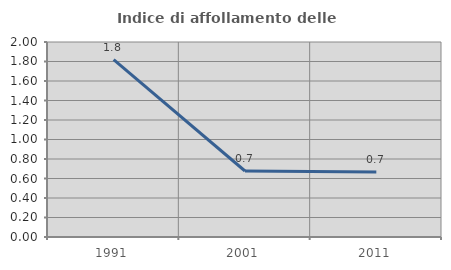
| Category | Indice di affollamento delle abitazioni  |
|---|---|
| 1991.0 | 1.819 |
| 2001.0 | 0.677 |
| 2011.0 | 0.666 |